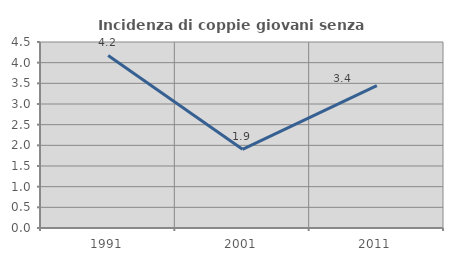
| Category | Incidenza di coppie giovani senza figli |
|---|---|
| 1991.0 | 4.174 |
| 2001.0 | 1.905 |
| 2011.0 | 3.444 |